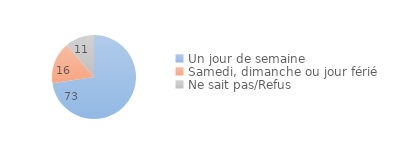
| Category | Series 0 |
|---|---|
| Un jour de semaine | 72.66 |
| Samedi, dimanche ou jour férié | 16.199 |
| Ne sait pas/Refus | 11.141 |